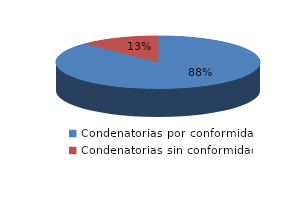
| Category | Series 0 |
|---|---|
| 0 | 21 |
| 1 | 3 |